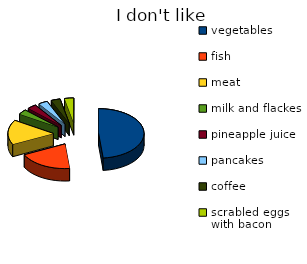
| Category | Series 0 |
|---|---|
| vegetables | 15 |
| fish | 6 |
| meat | 5 |
| milk and flackes | 1 |
| pineapple juice | 1 |
| pancakes | 1 |
| coffee | 1 |
| scrabled eggs with bacon | 1 |